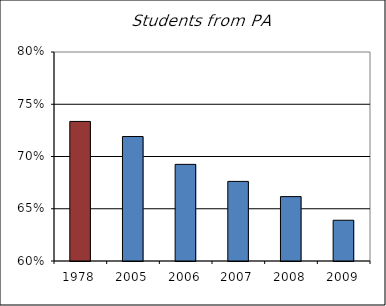
| Category | PA |
|---|---|
| 1978.0 | 0.734 |
| 2005.0 | 0.719 |
| 2006.0 | 0.692 |
| 2007.0 | 0.676 |
| 2008.0 | 0.662 |
| 2009.0 | 0.639 |